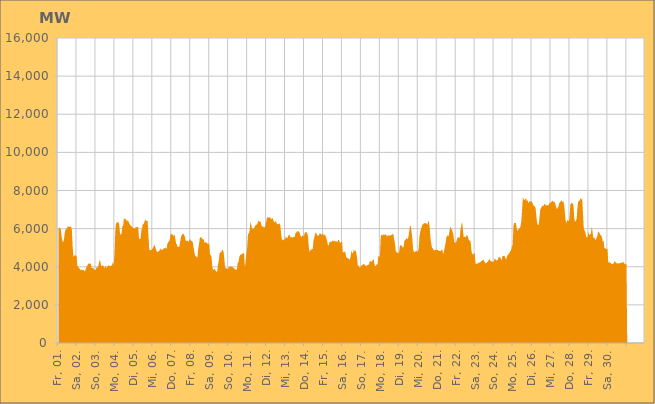
| Category | Series 0 |
|---|---|
|  Fr, 01.  | 5997.263 |
|  Fr, 01.  | 6059.2 |
|  Fr, 01.  | 6011.653 |
|  Fr, 01.  | 5983.616 |
|  Fr, 01.  | 5626.327 |
|  Fr, 01.  | 5371.606 |
|  Fr, 01.  | 5278.051 |
|  Fr, 01.  | 5424.711 |
|  Fr, 01.  | 5774.009 |
|  Fr, 01.  | 5956.72 |
|  Fr, 01.  | 5981.182 |
|  Fr, 01.  | 6022.98 |
|  Fr, 01.  | 6148.146 |
|  Fr, 01.  | 6089.399 |
|  Fr, 01.  | 6095.734 |
|  Fr, 01.  | 6098.939 |
|  Fr, 01.  | 6094.666 |
|  Sa, 02.  | 5969.158 |
|  Sa, 02.  | 5091.128 |
|  Sa, 02.  | 4512.842 |
|  Sa, 02.  | 4577.761 |
|  Sa, 02.  | 4610.996 |
|  Sa, 02.  | 4590.61 |
|  Sa, 02.  | 4552.821 |
|  Sa, 02.  | 4033.003 |
|  Sa, 02.  | 4029.001 |
|  Sa, 02.  | 3910.99 |
|  Sa, 02.  | 3919.831 |
|  Sa, 02.  | 3809.449 |
|  Sa, 02.  | 3856.236 |
|  Sa, 02.  | 3828.422 |
|  Sa, 02.  | 3830.793 |
|  Sa, 02.  | 3827.154 |
|  Sa, 02.  | 3757.773 |
|  Sa, 02.  | 3793.825 |
|  Sa, 02.  | 3929.401 |
|  Sa, 02.  | 4031.022 |
|  Sa, 02.  | 4089.596 |
|  Sa, 02.  | 4171.992 |
|  Sa, 02.  | 4158.878 |
|  Sa, 02.  | 4168.482 |
|  So, 03.  | 4169.219 |
|  So, 03.  | 3934.953 |
|  So, 03.  | 3933.16 |
|  So, 03.  | 3940.055 |
|  So, 03.  | 3883.709 |
|  So, 03.  | 3837.797 |
|  So, 03.  | 3809.188 |
|  So, 03.  | 3952.654 |
|  So, 03.  | 3970.681 |
|  So, 03.  | 3993.836 |
|  So, 03.  | 4106.275 |
|  So, 03.  | 4350.835 |
|  So, 03.  | 4303.707 |
|  So, 03.  | 4056.656 |
|  So, 03.  | 4040.701 |
|  So, 03.  | 4072.214 |
|  So, 03.  | 4058.355 |
|  So, 03.  | 3907.192 |
|  So, 03.  | 4037.689 |
|  So, 03.  | 4025.273 |
|  So, 03.  | 3943.784 |
|  So, 03.  | 4000.15 |
|  So, 03.  | 4066.4 |
|  So, 03.  | 4059.849 |
|  Mo, 04.  | 4046.355 |
|  Mo, 04.  | 4014.66 |
|  Mo, 04.  | 4068.038 |
|  Mo, 04.  | 4106.114 |
|  Mo, 04.  | 4250.016 |
|  Mo, 04.  | 4050.507 |
|  Mo, 04.  | 4668.23 |
|  Mo, 04.  | 5834.32 |
|  Mo, 04.  | 6349.245 |
|  Mo, 04.  | 6257.225 |
|  Mo, 04.  | 6352.91 |
|  Mo, 04.  | 6345.435 |
|  Mo, 04.  | 6217.273 |
|  Mo, 04.  | 5758.427 |
|  Mo, 04.  | 5657.3 |
|  Mo, 04.  | 5744.223 |
|  Mo, 04.  | 6135.324 |
|  Mo, 04.  | 6149.268 |
|  Mo, 04.  | 6559.067 |
|  Mo, 04.  | 6495.616 |
|  Mo, 04.  | 6509.198 |
|  Mo, 04.  | 6447.041 |
|  Mo, 04.  | 6389.316 |
|  Mo, 04.  | 6439.378 |
|  Di, 05.  | 6349.175 |
|  Di, 05.  | 6242.439 |
|  Di, 05.  | 6196.438 |
|  Di, 05.  | 6125.115 |
|  Di, 05.  | 6109.334 |
|  Di, 05.  | 6062.463 |
|  Di, 05.  | 6036.987 |
|  Di, 05.  | 6019.42 |
|  Di, 05.  | 5985.823 |
|  Di, 05.  | 6106.254 |
|  Di, 05.  | 6063.646 |
|  Di, 05.  | 6088.921 |
|  Di, 05.  | 6097.384 |
|  Di, 05.  | 5498.048 |
|  Di, 05.  | 5440.158 |
|  Di, 05.  | 5473.428 |
|  Di, 05.  | 5890.386 |
|  Di, 05.  | 6047.948 |
|  Di, 05.  | 6273.311 |
|  Di, 05.  | 6226.381 |
|  Di, 05.  | 6377.21 |
|  Di, 05.  | 6474.564 |
|  Di, 05.  | 6414.326 |
|  Di, 05.  | 6394.394 |
|  Mi, 06.  | 6393.707 |
|  Mi, 06.  | 5620.844 |
|  Mi, 06.  | 4907.825 |
|  Mi, 06.  | 4868.108 |
|  Mi, 06.  | 4872.85 |
|  Mi, 06.  | 4887.661 |
|  Mi, 06.  | 4943.115 |
|  Mi, 06.  | 5012.638 |
|  Mi, 06.  | 5134.223 |
|  Mi, 06.  | 5125.275 |
|  Mi, 06.  | 4975.766 |
|  Mi, 06.  | 4857.38 |
|  Mi, 06.  | 4760.427 |
|  Mi, 06.  | 4788.911 |
|  Mi, 06.  | 4816.596 |
|  Mi, 06.  | 4841.527 |
|  Mi, 06.  | 4968.487 |
|  Mi, 06.  | 4871.15 |
|  Mi, 06.  | 4905.973 |
|  Mi, 06.  | 4891.702 |
|  Mi, 06.  | 4966.083 |
|  Mi, 06.  | 4950.026 |
|  Mi, 06.  | 4993.382 |
|  Mi, 06.  | 4991.473 |
|  Do, 07.  | 4937.551 |
|  Do, 07.  | 5214.387 |
|  Do, 07.  | 5286.393 |
|  Do, 07.  | 5333.264 |
|  Do, 07.  | 5420.5 |
|  Do, 07.  | 5706.021 |
|  Do, 07.  | 5703.51 |
|  Do, 07.  | 5734.471 |
|  Do, 07.  | 5646.658 |
|  Do, 07.  | 5614.993 |
|  Do, 07.  | 5688.831 |
|  Do, 07.  | 5473.345 |
|  Do, 07.  | 5223.441 |
|  Do, 07.  | 5171.59 |
|  Do, 07.  | 5029.091 |
|  Do, 07.  | 5038.692 |
|  Do, 07.  | 5056.281 |
|  Do, 07.  | 5286.782 |
|  Do, 07.  | 5506.151 |
|  Do, 07.  | 5672.99 |
|  Do, 07.  | 5701.56 |
|  Do, 07.  | 5746.721 |
|  Do, 07.  | 5668.717 |
|  Do, 07.  | 5600.318 |
|  Fr, 08.  | 5387.764 |
|  Fr, 08.  | 5330.417 |
|  Fr, 08.  | 5376.425 |
|  Fr, 08.  | 5343.642 |
|  Fr, 08.  | 5298.215 |
|  Fr, 08.  | 5435.505 |
|  Fr, 08.  | 5433.922 |
|  Fr, 08.  | 5356.508 |
|  Fr, 08.  | 5357.647 |
|  Fr, 08.  | 5297.588 |
|  Fr, 08.  | 5045.099 |
|  Fr, 08.  | 4789.253 |
|  Fr, 08.  | 4593.113 |
|  Fr, 08.  | 4549.189 |
|  Fr, 08.  | 4502.644 |
|  Fr, 08.  | 4489.508 |
|  Fr, 08.  | 4946.009 |
|  Fr, 08.  | 5211.116 |
|  Fr, 08.  | 5517.446 |
|  Fr, 08.  | 5546.642 |
|  Fr, 08.  | 5553.015 |
|  Fr, 08.  | 5459.753 |
|  Fr, 08.  | 5442.192 |
|  Fr, 08.  | 5430.804 |
|  Sa, 09.  | 5261.521 |
|  Sa, 09.  | 5270.209 |
|  Sa, 09.  | 5287.051 |
|  Sa, 09.  | 5246.904 |
|  Sa, 09.  | 5194.462 |
|  Sa, 09.  | 5224.781 |
|  Sa, 09.  | 5182.962 |
|  Sa, 09.  | 4582.059 |
|  Sa, 09.  | 4652.729 |
|  Sa, 09.  | 4415.733 |
|  Sa, 09.  | 3937.11 |
|  Sa, 09.  | 3808.753 |
|  Sa, 09.  | 3896.977 |
|  Sa, 09.  | 3875.825 |
|  Sa, 09.  | 3791.764 |
|  Sa, 09.  | 3745.159 |
|  Sa, 09.  | 3727.474 |
|  Sa, 09.  | 4110.375 |
|  Sa, 09.  | 4313.811 |
|  Sa, 09.  | 4707.346 |
|  Sa, 09.  | 4757.865 |
|  Sa, 09.  | 4765.432 |
|  Sa, 09.  | 4852.069 |
|  Sa, 09.  | 4909.951 |
|  So, 10.  | 4795.521 |
|  So, 10.  | 4423.469 |
|  So, 10.  | 3972.848 |
|  So, 10.  | 3914.235 |
|  So, 10.  | 3921.718 |
|  So, 10.  | 3868.687 |
|  So, 10.  | 3905.048 |
|  So, 10.  | 4003.061 |
|  So, 10.  | 3984.958 |
|  So, 10.  | 4017.252 |
|  So, 10.  | 4004.603 |
|  So, 10.  | 3990.037 |
|  So, 10.  | 3967.465 |
|  So, 10.  | 3926.303 |
|  So, 10.  | 3899.887 |
|  So, 10.  | 3847.055 |
|  So, 10.  | 3850.999 |
|  So, 10.  | 3848.189 |
|  So, 10.  | 4215.199 |
|  So, 10.  | 4250.145 |
|  So, 10.  | 4511.607 |
|  So, 10.  | 4607.174 |
|  So, 10.  | 4635.355 |
|  So, 10.  | 4657.923 |
|  Mo, 11.  | 4689.639 |
|  Mo, 11.  | 4690.265 |
|  Mo, 11.  | 4725.281 |
|  Mo, 11.  | 3967.779 |
|  Mo, 11.  | 4296.447 |
|  Mo, 11.  | 4688.495 |
|  Mo, 11.  | 5035.489 |
|  Mo, 11.  | 5718.849 |
|  Mo, 11.  | 5750.007 |
|  Mo, 11.  | 5873.518 |
|  Mo, 11.  | 6341.677 |
|  Mo, 11.  | 6222.515 |
|  Mo, 11.  | 6021.15 |
|  Mo, 11.  | 5957.063 |
|  Mo, 11.  | 5995.987 |
|  Mo, 11.  | 6072.977 |
|  Mo, 11.  | 6124.741 |
|  Mo, 11.  | 6218.759 |
|  Mo, 11.  | 6196.554 |
|  Mo, 11.  | 6276.101 |
|  Mo, 11.  | 6412.224 |
|  Mo, 11.  | 6395.658 |
|  Mo, 11.  | 6346.412 |
|  Mo, 11.  | 6380.561 |
|  Di, 12.  | 6162.356 |
|  Di, 12.  | 6099.648 |
|  Di, 12.  | 6136.149 |
|  Di, 12.  | 6060.358 |
|  Di, 12.  | 6071.038 |
|  Di, 12.  | 6152.988 |
|  Di, 12.  | 6361.874 |
|  Di, 12.  | 6572.053 |
|  Di, 12.  | 6619.367 |
|  Di, 12.  | 6559.654 |
|  Di, 12.  | 6581.922 |
|  Di, 12.  | 6597.932 |
|  Di, 12.  | 6533.067 |
|  Di, 12.  | 6492.765 |
|  Di, 12.  | 6572.947 |
|  Di, 12.  | 6451.49 |
|  Di, 12.  | 6332.813 |
|  Di, 12.  | 6348.251 |
|  Di, 12.  | 6396.181 |
|  Di, 12.  | 6309.49 |
|  Di, 12.  | 6229.995 |
|  Di, 12.  | 6226.544 |
|  Di, 12.  | 6257.222 |
|  Di, 12.  | 6276.177 |
|  Mi, 13.  | 6144.036 |
|  Mi, 13.  | 5694.971 |
|  Mi, 13.  | 5414.879 |
|  Mi, 13.  | 5388.655 |
|  Mi, 13.  | 5403.796 |
|  Mi, 13.  | 5446.689 |
|  Mi, 13.  | 5454.549 |
|  Mi, 13.  | 5604.952 |
|  Mi, 13.  | 5513.463 |
|  Mi, 13.  | 5494.672 |
|  Mi, 13.  | 5627.587 |
|  Mi, 13.  | 5674.731 |
|  Mi, 13.  | 5637.378 |
|  Mi, 13.  | 5514.12 |
|  Mi, 13.  | 5575.613 |
|  Mi, 13.  | 5511.281 |
|  Mi, 13.  | 5568.594 |
|  Mi, 13.  | 5562.267 |
|  Mi, 13.  | 5544.176 |
|  Mi, 13.  | 5738.608 |
|  Mi, 13.  | 5845.952 |
|  Mi, 13.  | 5780.693 |
|  Mi, 13.  | 5889.331 |
|  Mi, 13.  | 5853.848 |
|  Do, 14.  | 5825.016 |
|  Do, 14.  | 5687.629 |
|  Do, 14.  | 5574.408 |
|  Do, 14.  | 5579.606 |
|  Do, 14.  | 5648.35 |
|  Do, 14.  | 5601.552 |
|  Do, 14.  | 5642.361 |
|  Do, 14.  | 5788.818 |
|  Do, 14.  | 5823.691 |
|  Do, 14.  | 5808.078 |
|  Do, 14.  | 5768.619 |
|  Do, 14.  | 5561.406 |
|  Do, 14.  | 5025.015 |
|  Do, 14.  | 4771.457 |
|  Do, 14.  | 4869.25 |
|  Do, 14.  | 4897.377 |
|  Do, 14.  | 4901.232 |
|  Do, 14.  | 4962.423 |
|  Do, 14.  | 5401.116 |
|  Do, 14.  | 5556.25 |
|  Do, 14.  | 5740.848 |
|  Do, 14.  | 5820.673 |
|  Do, 14.  | 5683.7 |
|  Do, 14.  | 5643.651 |
|  Fr, 15.  | 5609.4 |
|  Fr, 15.  | 5685.953 |
|  Fr, 15.  | 5757.999 |
|  Fr, 15.  | 5733.699 |
|  Fr, 15.  | 5684.637 |
|  Fr, 15.  | 5670.2 |
|  Fr, 15.  | 5761.612 |
|  Fr, 15.  | 5623.757 |
|  Fr, 15.  | 5707.465 |
|  Fr, 15.  | 5638.145 |
|  Fr, 15.  | 5505.699 |
|  Fr, 15.  | 5381.959 |
|  Fr, 15.  | 5168.098 |
|  Fr, 15.  | 5089.66 |
|  Fr, 15.  | 5278.191 |
|  Fr, 15.  | 5295.875 |
|  Fr, 15.  | 5347.603 |
|  Fr, 15.  | 5282.947 |
|  Fr, 15.  | 5398.256 |
|  Fr, 15.  | 5360.669 |
|  Fr, 15.  | 5326.505 |
|  Fr, 15.  | 5361.443 |
|  Fr, 15.  | 5320.928 |
|  Fr, 15.  | 5347.815 |
|  Sa, 16.  | 5262.751 |
|  Sa, 16.  | 5403.586 |
|  Sa, 16.  | 5415.86 |
|  Sa, 16.  | 5305.051 |
|  Sa, 16.  | 5241.75 |
|  Sa, 16.  | 5273.511 |
|  Sa, 16.  | 5378.67 |
|  Sa, 16.  | 4756.005 |
|  Sa, 16.  | 4759.908 |
|  Sa, 16.  | 4766.453 |
|  Sa, 16.  | 4828.934 |
|  Sa, 16.  | 4579.169 |
|  Sa, 16.  | 4457.708 |
|  Sa, 16.  | 4451.73 |
|  Sa, 16.  | 4453.254 |
|  Sa, 16.  | 4369.166 |
|  Sa, 16.  | 4389.895 |
|  Sa, 16.  | 4549.67 |
|  Sa, 16.  | 4859.929 |
|  Sa, 16.  | 4712.056 |
|  Sa, 16.  | 4727.784 |
|  Sa, 16.  | 4919.944 |
|  Sa, 16.  | 4789.602 |
|  Sa, 16.  | 4864.649 |
|  So, 17.  | 4764.036 |
|  So, 17.  | 4464.444 |
|  So, 17.  | 4084.325 |
|  So, 17.  | 4040.727 |
|  So, 17.  | 3969.849 |
|  So, 17.  | 3959.9 |
|  So, 17.  | 4027.625 |
|  So, 17.  | 4073.368 |
|  So, 17.  | 4099.527 |
|  So, 17.  | 4152.207 |
|  So, 17.  | 4134.943 |
|  So, 17.  | 4082.713 |
|  So, 17.  | 4045.433 |
|  So, 17.  | 4047.644 |
|  So, 17.  | 4075.81 |
|  So, 17.  | 4114.276 |
|  So, 17.  | 4098.164 |
|  So, 17.  | 4295.432 |
|  So, 17.  | 4292.263 |
|  So, 17.  | 4255.499 |
|  So, 17.  | 4302.208 |
|  So, 17.  | 4348.993 |
|  So, 17.  | 4398.661 |
|  So, 17.  | 4129.845 |
|  Mo, 18.  | 4039.964 |
|  Mo, 18.  | 4045.507 |
|  Mo, 18.  | 4141.188 |
|  Mo, 18.  | 4118.067 |
|  Mo, 18.  | 4583.03 |
|  Mo, 18.  | 4521.954 |
|  Mo, 18.  | 4567.46 |
|  Mo, 18.  | 5578.002 |
|  Mo, 18.  | 5687.24 |
|  Mo, 18.  | 5630.843 |
|  Mo, 18.  | 5700.724 |
|  Mo, 18.  | 5666.191 |
|  Mo, 18.  | 5659.724 |
|  Mo, 18.  | 5720.894 |
|  Mo, 18.  | 5667.003 |
|  Mo, 18.  | 5580.601 |
|  Mo, 18.  | 5672.023 |
|  Mo, 18.  | 5629.699 |
|  Mo, 18.  | 5640.064 |
|  Mo, 18.  | 5624.278 |
|  Mo, 18.  | 5669.926 |
|  Mo, 18.  | 5667.239 |
|  Mo, 18.  | 5712.709 |
|  Mo, 18.  | 5698.74 |
|  Di, 19.  | 5423.123 |
|  Di, 19.  | 5242.728 |
|  Di, 19.  | 4839.495 |
|  Di, 19.  | 4761.609 |
|  Di, 19.  | 4727.413 |
|  Di, 19.  | 4744.295 |
|  Di, 19.  | 4688.712 |
|  Di, 19.  | 5051.082 |
|  Di, 19.  | 5153.81 |
|  Di, 19.  | 5108.968 |
|  Di, 19.  | 5078.962 |
|  Di, 19.  | 4993.436 |
|  Di, 19.  | 5054.825 |
|  Di, 19.  | 5367.234 |
|  Di, 19.  | 5392.05 |
|  Di, 19.  | 5472.609 |
|  Di, 19.  | 5498.198 |
|  Di, 19.  | 5443.207 |
|  Di, 19.  | 5549.854 |
|  Di, 19.  | 5839.006 |
|  Di, 19.  | 6143.055 |
|  Di, 19.  | 6148.624 |
|  Di, 19.  | 5838.533 |
|  Di, 19.  | 5473.023 |
|  Mi, 20.  | 4913.897 |
|  Mi, 20.  | 4765.178 |
|  Mi, 20.  | 4783.103 |
|  Mi, 20.  | 4805.917 |
|  Mi, 20.  | 4825.364 |
|  Mi, 20.  | 4800.871 |
|  Mi, 20.  | 4798.473 |
|  Mi, 20.  | 4964.093 |
|  Mi, 20.  | 5572.614 |
|  Mi, 20.  | 5840.741 |
|  Mi, 20.  | 5984.592 |
|  Mi, 20.  | 6135.188 |
|  Mi, 20.  | 6218.104 |
|  Mi, 20.  | 6256.61 |
|  Mi, 20.  | 6286.306 |
|  Mi, 20.  | 6280.162 |
|  Mi, 20.  | 6286.124 |
|  Mi, 20.  | 6272.936 |
|  Mi, 20.  | 6191.806 |
|  Mi, 20.  | 6392.126 |
|  Mi, 20.  | 6373.223 |
|  Mi, 20.  | 6035.903 |
|  Mi, 20.  | 5484.663 |
|  Mi, 20.  | 5185.229 |
|  Do, 21.  | 4989.03 |
|  Do, 21.  | 4960.608 |
|  Do, 21.  | 4879.821 |
|  Do, 21.  | 4864.726 |
|  Do, 21.  | 4870.026 |
|  Do, 21.  | 4888.713 |
|  Do, 21.  | 4894.001 |
|  Do, 21.  | 4898.538 |
|  Do, 21.  | 4829.356 |
|  Do, 21.  | 4835.206 |
|  Do, 21.  | 4830.932 |
|  Do, 21.  | 4814.667 |
|  Do, 21.  | 4903.846 |
|  Do, 21.  | 4879.06 |
|  Do, 21.  | 4669.644 |
|  Do, 21.  | 4808.026 |
|  Do, 21.  | 5030.311 |
|  Do, 21.  | 5215.116 |
|  Do, 21.  | 5503.189 |
|  Do, 21.  | 5664.418 |
|  Do, 21.  | 5581.631 |
|  Do, 21.  | 5620.151 |
|  Do, 21.  | 5859.904 |
|  Do, 21.  | 6125.016 |
|  Fr, 22.  | 6009.754 |
|  Fr, 22.  | 5952.408 |
|  Fr, 22.  | 5835.912 |
|  Fr, 22.  | 5682.996 |
|  Fr, 22.  | 5296.813 |
|  Fr, 22.  | 5286.784 |
|  Fr, 22.  | 5237.652 |
|  Fr, 22.  | 5367.618 |
|  Fr, 22.  | 5517.921 |
|  Fr, 22.  | 5530.946 |
|  Fr, 22.  | 5547.917 |
|  Fr, 22.  | 5498.29 |
|  Fr, 22.  | 5958.792 |
|  Fr, 22.  | 6182.941 |
|  Fr, 22.  | 6359.541 |
|  Fr, 22.  | 5946.894 |
|  Fr, 22.  | 5548.537 |
|  Fr, 22.  | 5578.699 |
|  Fr, 22.  | 5553.096 |
|  Fr, 22.  | 5580.098 |
|  Fr, 22.  | 5670.545 |
|  Fr, 22.  | 5629.706 |
|  Fr, 22.  | 5469.707 |
|  Fr, 22.  | 5350.349 |
|  Sa, 23.  | 5406.04 |
|  Sa, 23.  | 5245.051 |
|  Sa, 23.  | 4787.419 |
|  Sa, 23.  | 4666.088 |
|  Sa, 23.  | 4629.01 |
|  Sa, 23.  | 4730.233 |
|  Sa, 23.  | 4704.806 |
|  Sa, 23.  | 4159.666 |
|  Sa, 23.  | 4161.198 |
|  Sa, 23.  | 4154.635 |
|  Sa, 23.  | 4180.589 |
|  Sa, 23.  | 4208.152 |
|  Sa, 23.  | 4223.54 |
|  Sa, 23.  | 4231.964 |
|  Sa, 23.  | 4296.909 |
|  Sa, 23.  | 4315.77 |
|  Sa, 23.  | 4335.537 |
|  Sa, 23.  | 4365.844 |
|  Sa, 23.  | 4286.067 |
|  Sa, 23.  | 4221.682 |
|  Sa, 23.  | 4165.797 |
|  Sa, 23.  | 4212.825 |
|  Sa, 23.  | 4239.44 |
|  Sa, 23.  | 4293.427 |
|  So, 24.  | 4359.202 |
|  So, 24.  | 4403.72 |
|  So, 24.  | 4307.84 |
|  So, 24.  | 4276.795 |
|  So, 24.  | 4279.05 |
|  So, 24.  | 4272.922 |
|  So, 24.  | 4248.826 |
|  So, 24.  | 4427.013 |
|  So, 24.  | 4405.714 |
|  So, 24.  | 4351.25 |
|  So, 24.  | 4311.864 |
|  So, 24.  | 4352.163 |
|  So, 24.  | 4483.528 |
|  So, 24.  | 4502.229 |
|  So, 24.  | 4522.559 |
|  So, 24.  | 4408.776 |
|  So, 24.  | 4342.308 |
|  So, 24.  | 4561.504 |
|  So, 24.  | 4563.25 |
|  So, 24.  | 4582.002 |
|  So, 24.  | 4551.676 |
|  So, 24.  | 4426.096 |
|  So, 24.  | 4415.863 |
|  So, 24.  | 4578.96 |
|  Mo, 25.  | 4616.971 |
|  Mo, 25.  | 4682.953 |
|  Mo, 25.  | 4724.282 |
|  Mo, 25.  | 4835.352 |
|  Mo, 25.  | 4847.753 |
|  Mo, 25.  | 5080.439 |
|  Mo, 25.  | 5125.894 |
|  Mo, 25.  | 6139.036 |
|  Mo, 25.  | 6318.158 |
|  Mo, 25.  | 6278.512 |
|  Mo, 25.  | 6308.821 |
|  Mo, 25.  | 6040.447 |
|  Mo, 25.  | 5881.648 |
|  Mo, 25.  | 5939.499 |
|  Mo, 25.  | 6006.697 |
|  Mo, 25.  | 6022.041 |
|  Mo, 25.  | 6127.102 |
|  Mo, 25.  | 6411.242 |
|  Mo, 25.  | 7022.158 |
|  Mo, 25.  | 7677.869 |
|  Mo, 25.  | 7515.632 |
|  Mo, 25.  | 7502.894 |
|  Mo, 25.  | 7552.425 |
|  Mo, 25.  | 7583.66 |
|  Di, 26.  | 7418.468 |
|  Di, 26.  | 7501.247 |
|  Di, 26.  | 7331.611 |
|  Di, 26.  | 7418.166 |
|  Di, 26.  | 7435.918 |
|  Di, 26.  | 7409.961 |
|  Di, 26.  | 7453.316 |
|  Di, 26.  | 7339.859 |
|  Di, 26.  | 7270.79 |
|  Di, 26.  | 7164.293 |
|  Di, 26.  | 7181.442 |
|  Di, 26.  | 7077.884 |
|  Di, 26.  | 6636.241 |
|  Di, 26.  | 6292.187 |
|  Di, 26.  | 6175.934 |
|  Di, 26.  | 6210.45 |
|  Di, 26.  | 6604.75 |
|  Di, 26.  | 7019.137 |
|  Di, 26.  | 7076.079 |
|  Di, 26.  | 7174.305 |
|  Di, 26.  | 7201.03 |
|  Di, 26.  | 7175.742 |
|  Di, 26.  | 7305.375 |
|  Di, 26.  | 7291.077 |
|  Mi, 27.  | 7195.126 |
|  Mi, 27.  | 7235.042 |
|  Mi, 27.  | 7225.239 |
|  Mi, 27.  | 7211.414 |
|  Mi, 27.  | 7273.75 |
|  Mi, 27.  | 7357.061 |
|  Mi, 27.  | 7348.511 |
|  Mi, 27.  | 7406.006 |
|  Mi, 27.  | 7460.251 |
|  Mi, 27.  | 7440.56 |
|  Mi, 27.  | 7392.917 |
|  Mi, 27.  | 7413.512 |
|  Mi, 27.  | 7291.971 |
|  Mi, 27.  | 7142.21 |
|  Mi, 27.  | 7022.797 |
|  Mi, 27.  | 7081.053 |
|  Mi, 27.  | 7191.745 |
|  Mi, 27.  | 7331.596 |
|  Mi, 27.  | 7394.743 |
|  Mi, 27.  | 7449.531 |
|  Mi, 27.  | 7496.354 |
|  Mi, 27.  | 7381.941 |
|  Mi, 27.  | 7458.627 |
|  Mi, 27.  | 7289.381 |
|  Do, 28.  | 6899.082 |
|  Do, 28.  | 6435.8 |
|  Do, 28.  | 6274.431 |
|  Do, 28.  | 6442.867 |
|  Do, 28.  | 6427.881 |
|  Do, 28.  | 6375.758 |
|  Do, 28.  | 6589.959 |
|  Do, 28.  | 7275.483 |
|  Do, 28.  | 7323.928 |
|  Do, 28.  | 7353.669 |
|  Do, 28.  | 7315.024 |
|  Do, 28.  | 7227.482 |
|  Do, 28.  | 6531.019 |
|  Do, 28.  | 6350.649 |
|  Do, 28.  | 6417.904 |
|  Do, 28.  | 6517.392 |
|  Do, 28.  | 7091.402 |
|  Do, 28.  | 7434.24 |
|  Do, 28.  | 7428.058 |
|  Do, 28.  | 7500.317 |
|  Do, 28.  | 7597.422 |
|  Do, 28.  | 7515.735 |
|  Do, 28.  | 7597.753 |
|  Do, 28.  | 6816.534 |
|  Fr, 29.  | 6015.283 |
|  Fr, 29.  | 5905.647 |
|  Fr, 29.  | 5810.148 |
|  Fr, 29.  | 5588.576 |
|  Fr, 29.  | 5518.135 |
|  Fr, 29.  | 5584.535 |
|  Fr, 29.  | 5836.367 |
|  Fr, 29.  | 5661.169 |
|  Fr, 29.  | 5705.81 |
|  Fr, 29.  | 5732.416 |
|  Fr, 29.  | 6094.482 |
|  Fr, 29.  | 5872.194 |
|  Fr, 29.  | 5530.264 |
|  Fr, 29.  | 5516.035 |
|  Fr, 29.  | 5482.867 |
|  Fr, 29.  | 5391.963 |
|  Fr, 29.  | 5518.157 |
|  Fr, 29.  | 5575.318 |
|  Fr, 29.  | 5824.601 |
|  Fr, 29.  | 5845.124 |
|  Fr, 29.  | 5753.333 |
|  Fr, 29.  | 5670.449 |
|  Fr, 29.  | 5639.653 |
|  Fr, 29.  | 5544.443 |
|  Sa, 30.  | 5325.898 |
|  Sa, 30.  | 5365.495 |
|  Sa, 30.  | 5001.387 |
|  Sa, 30.  | 4954.721 |
|  Sa, 30.  | 4947.908 |
|  Sa, 30.  | 4955.149 |
|  Sa, 30.  | 4928.81 |
|  Sa, 30.  | 4227.633 |
|  Sa, 30.  | 4233.206 |
|  Sa, 30.  | 4219.277 |
|  Sa, 30.  | 4202.688 |
|  Sa, 30.  | 4153.597 |
|  Sa, 30.  | 4131.662 |
|  Sa, 30.  | 4150.384 |
|  Sa, 30.  | 4196.269 |
|  Sa, 30.  | 4302.266 |
|  Sa, 30.  | 4247.692 |
|  Sa, 30.  | 4179.105 |
|  Sa, 30.  | 4184.293 |
|  Sa, 30.  | 4165.937 |
|  Sa, 30.  | 4170.819 |
|  Sa, 30.  | 4179.116 |
|  Sa, 30.  | 4206.72 |
|  Sa, 30.  | 4184.05 |
|  So, 01.  | 4218.886 |
|  So, 01.  | 4218.483 |
|  So, 01.  | 4271.312 |
|  So, 01.  | 4168.104 |
|  So, 01.  | 4161.036 |
|  So, 01.  | 4118.151 |
|    | 4155.19 |
|    | 0 |
|    | 0 |
|    | 0 |
|    | 0 |
|    | 0 |
|    | 0 |
|    | 0 |
|    | 0 |
|    | 0 |
|    | 0 |
|    | 0 |
|    | 0 |
|    | 0 |
|    | 0 |
|    | 0 |
|    | 0 |
|    | 0 |
|    | 0 |
|    | 0 |
|    | 0 |
|    | 0 |
|    | 0 |
|    | 0 |